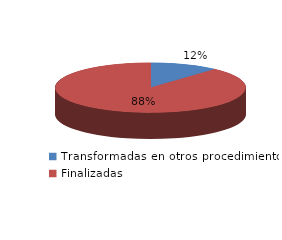
| Category | Series 0 |
|---|---|
| Transformadas en otros procedimientos | 4099 |
| Finalizadas | 31281 |